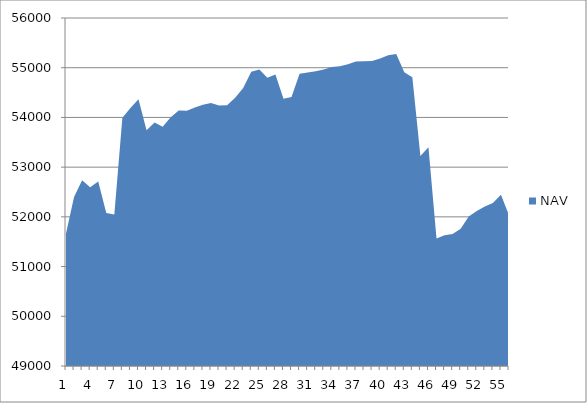
| Category | NAV |
|---|---|
| 0 | 51667 |
| 1 | 52397 |
| 2 | 52733.957 |
| 3 | 52597.875 |
| 4 | 52708.772 |
| 5 | 52075.184 |
| 6 | 52046.775 |
| 7 | 53991.219 |
| 8 | 54189.909 |
| 9 | 54364.909 |
| 10 | 53739.909 |
| 11 | 53899.542 |
| 12 | 53812.294 |
| 13 | 54003.961 |
| 14 | 54140.037 |
| 15 | 54132.37 |
| 16 | 54197.37 |
| 17 | 54255.812 |
| 18 | 54292.622 |
| 19 | 54240.699 |
| 20 | 54246.834 |
| 21 | 54397.391 |
| 22 | 54592.197 |
| 23 | 54920.119 |
| 24 | 54963.245 |
| 25 | 54796.799 |
| 26 | 54863.963 |
| 27 | 54375.975 |
| 28 | 54409.015 |
| 29 | 54878.402 |
| 30 | 54905.151 |
| 31 | 54927.958 |
| 32 | 54964.157 |
| 33 | 55012.385 |
| 34 | 55031.616 |
| 35 | 55070.791 |
| 36 | 55126.461 |
| 37 | 55131.71 |
| 38 | 55133.391 |
| 39 | 55184.783 |
| 40 | 55249.119 |
| 41 | 55278.196 |
| 42 | 54909.993 |
| 43 | 54807.052 |
| 44 | 53224.092 |
| 45 | 53401.214 |
| 46 | 51567.133 |
| 47 | 51627.536 |
| 48 | 51656.382 |
| 49 | 51762.295 |
| 50 | 52007.329 |
| 51 | 52120.149 |
| 52 | 52206.26 |
| 53 | 52279.944 |
| 54 | 52443.406 |
| 55 | 52034.315 |